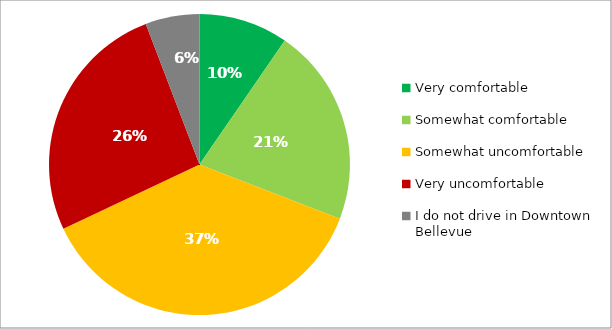
| Category | Responses |
|---|---|
| Very comfortable | 0.096 |
| Somewhat comfortable | 0.213 |
| Somewhat uncomfortable | 0.371 |
| Very uncomfortable | 0.262 |
| I do not drive in Downtown Bellevue | 0.058 |